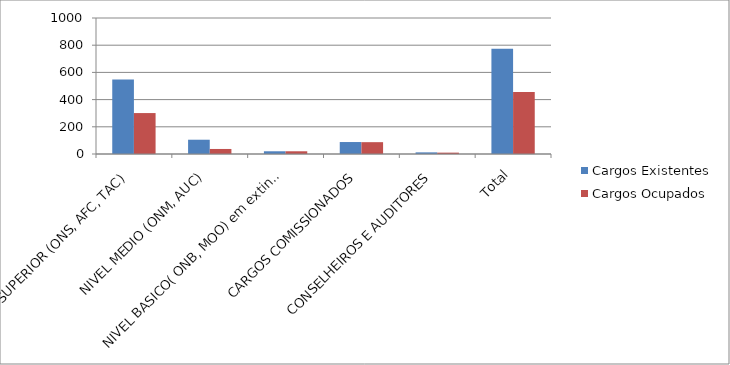
| Category | Cargos Existentes | Cargos Ocupados |
|---|---|---|
| NIVEL SUPERIOR (ONS, AFC, TAC) | 548 | 301 |
| NIVEL MEDIO (ONM, AUC) | 105 | 37 |
| NIVEL BASICO( ONB, MOO) em extinção | 20 | 20 |
| CARGOS COMISSIONADOS | 88 | 87 |
| CONSELHEIROS E AUDITORES | 12 | 10 |
| Total | 773 | 455 |